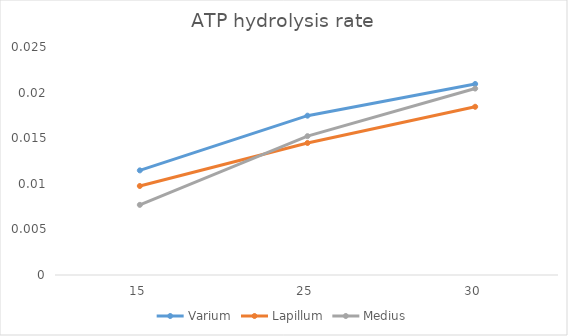
| Category | Varium | Lapillum | Medius |
|---|---|---|---|
| 15.0 | 0.011 | 0.01 | 0.008 |
| 25.0 | 0.017 | 0.014 | 0.015 |
| 30.0 | 0.021 | 0.018 | 0.02 |